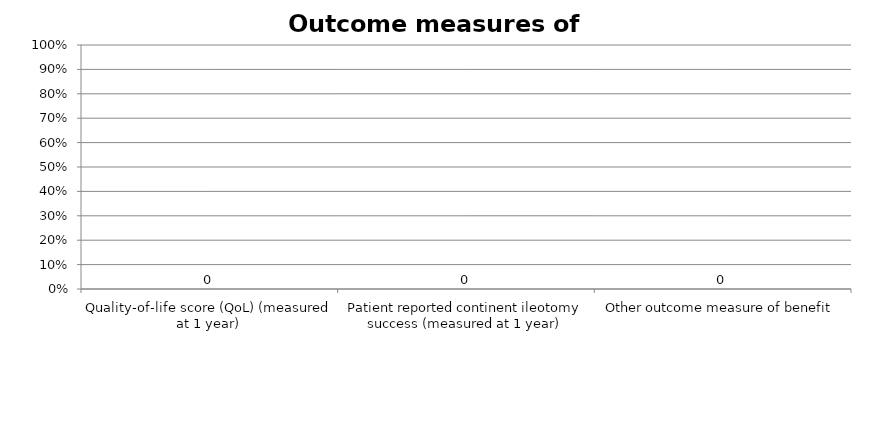
| Category | Series 0 |
|---|---|
| Quality-of-life score (QoL) (measured at 1 year) | 0 |
| Patient reported continent ileotomy success (measured at 1 year) | 0 |
| Other outcome measure of benefit | 0 |